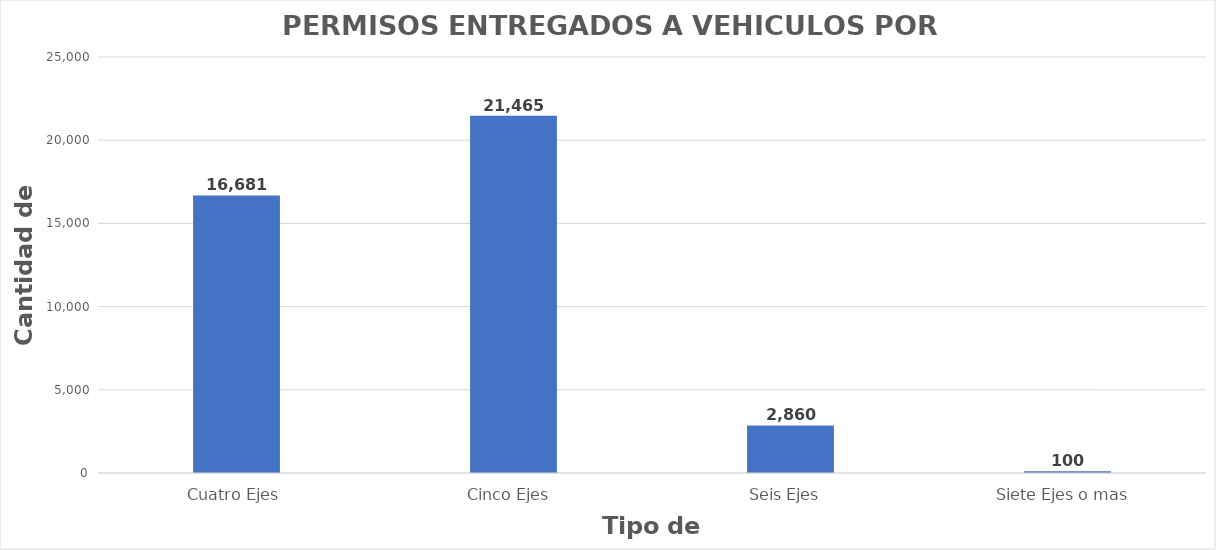
| Category | Series 0 |
|---|---|
| Cuatro Ejes | 16681 |
| Cinco Ejes  | 21465 |
| Seis Ejes  | 2860 |
| Siete Ejes o mas  | 100 |